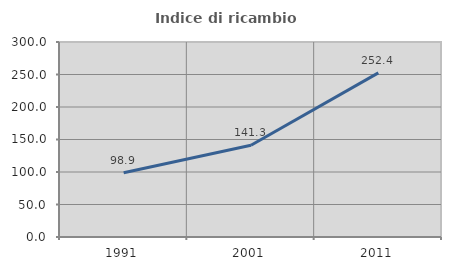
| Category | Indice di ricambio occupazionale  |
|---|---|
| 1991.0 | 98.898 |
| 2001.0 | 141.259 |
| 2011.0 | 252.427 |